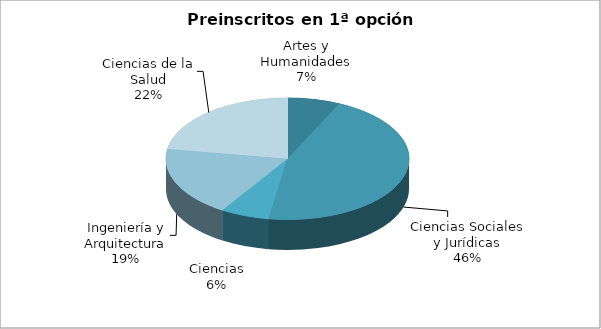
| Category | Series 0 |
|---|---|
| Artes y Humanidades | 480 |
| Ciencias Sociales y Jurídicas | 3144 |
| Ciencias | 445 |
| Ingeniería y Arquitectura | 1284 |
| Ciencias de la Salud | 1548 |